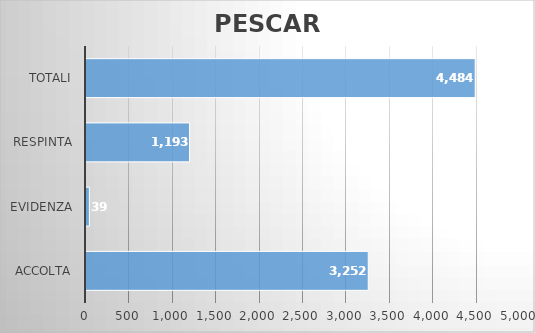
| Category | PESCARA |
|---|---|
| ACCOLTA | 3252 |
| EVIDENZA | 39 |
| RESPINTA | 1193 |
| Totali | 4484 |